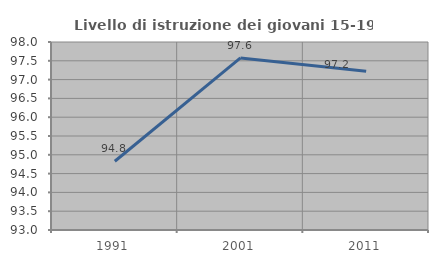
| Category | Livello di istruzione dei giovani 15-19 anni |
|---|---|
| 1991.0 | 94.828 |
| 2001.0 | 97.576 |
| 2011.0 | 97.222 |